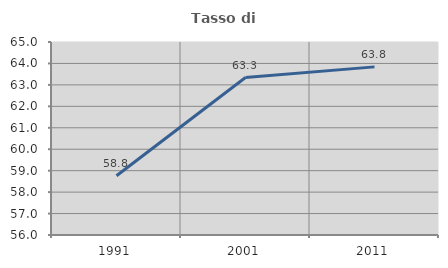
| Category | Tasso di occupazione   |
|---|---|
| 1991.0 | 58.762 |
| 2001.0 | 63.344 |
| 2011.0 | 63.84 |